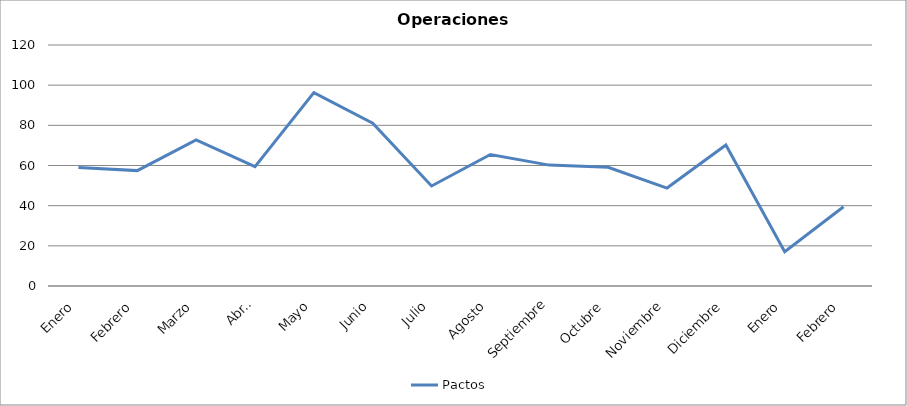
| Category | Pactos |
|---|---|
| Enero | 59 |
| Febrero | 57.45 |
| Marzo | 72.696 |
| Abril | 59.45 |
| Mayo | 96.318 |
| Junio | 81.095 |
| Julio | 49.81 |
| Agosto | 65.455 |
| Septiembre | 60.19 |
| Octubre | 59.105 |
| Noviembre | 48.762 |
| Diciembre | 70.19 |
| Enero | 17.091 |
| Febrero | 39.476 |